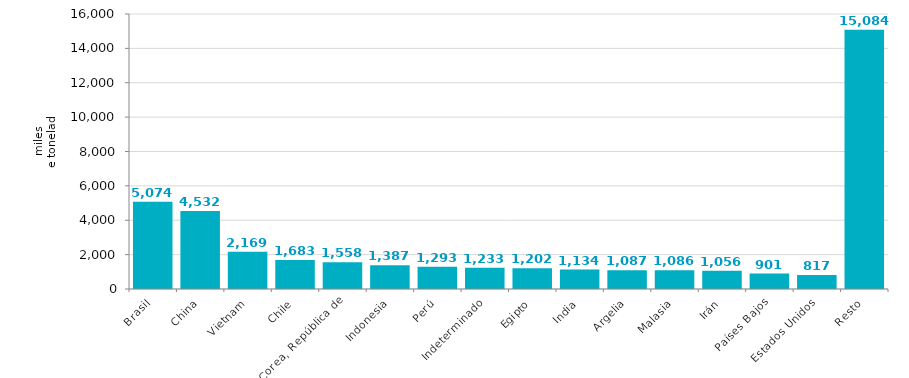
| Category | Series 0 |
|---|---|
| Brasil | 5073.691 |
| China | 4531.517 |
| Vietnam | 2169.095 |
| Chile | 1683.047 |
| Corea, República de | 1558.34 |
| Indonesia | 1386.794 |
| Perú | 1292.598 |
| Indeterminado | 1233.243 |
| Egipto | 1201.833 |
| India | 1134.21 |
| Argelia | 1086.918 |
| Malasia | 1085.643 |
| Irán | 1055.565 |
| Países Bajos | 901.104 |
| Estados Unidos | 817.249 |
| Resto | 15083.681 |